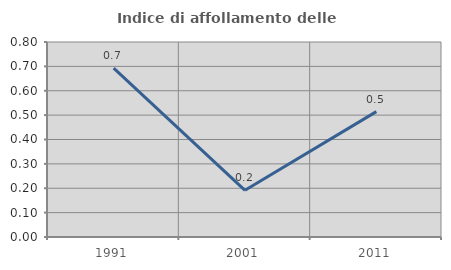
| Category | Indice di affollamento delle abitazioni  |
|---|---|
| 1991.0 | 0.693 |
| 2001.0 | 0.192 |
| 2011.0 | 0.514 |